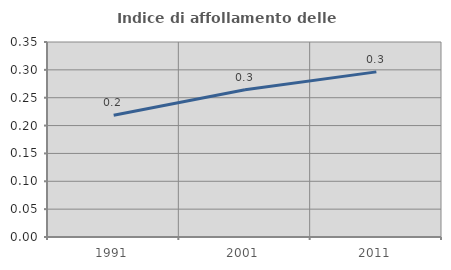
| Category | Indice di affollamento delle abitazioni  |
|---|---|
| 1991.0 | 0.219 |
| 2001.0 | 0.264 |
| 2011.0 | 0.296 |